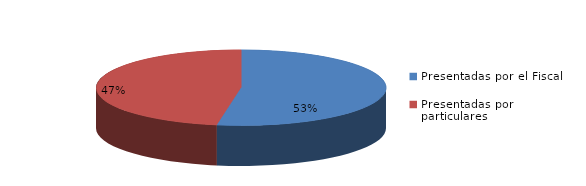
| Category | Series 0 |
|---|---|
| Presentadas por el Fiscal | 119 |
| Presentadas por particulares | 107 |